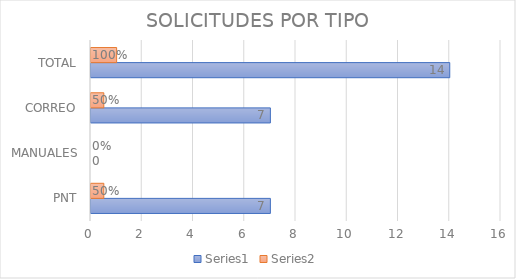
| Category | Series 0 | Series 1 |
|---|---|---|
| PNT | 7 | 0.5 |
| MANUALES | 0 | 0 |
| CORREO | 7 | 0.5 |
| TOTAL | 14 | 1 |